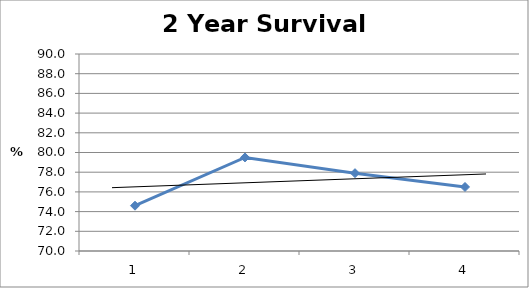
| Category | Series 0 |
|---|---|
| 0 | 74.6 |
| 1 | 79.5 |
| 2 | 77.9 |
| 3 | 76.5 |